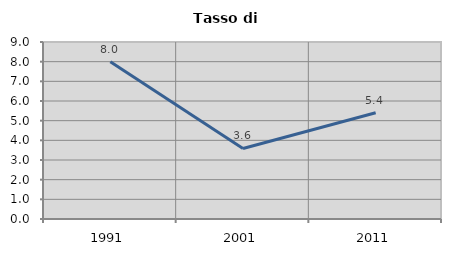
| Category | Tasso di disoccupazione   |
|---|---|
| 1991.0 | 7.996 |
| 2001.0 | 3.587 |
| 2011.0 | 5.402 |